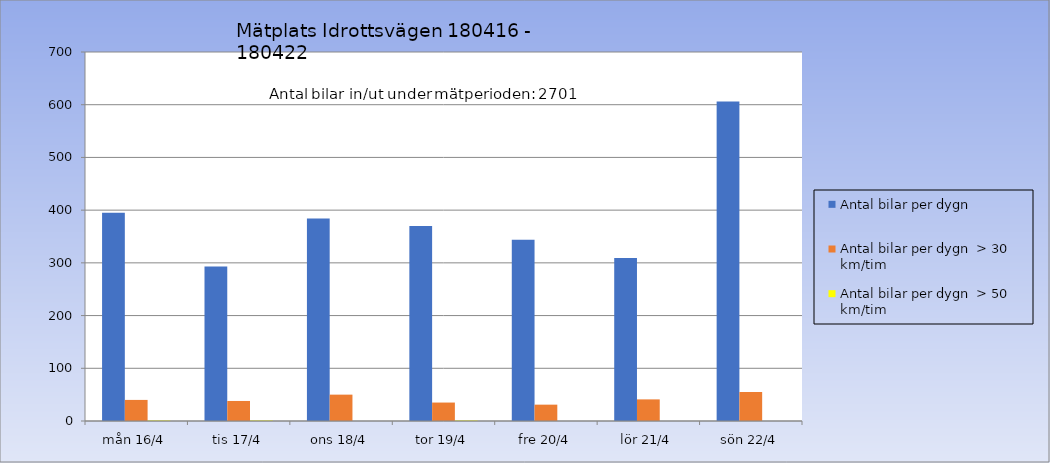
| Category | Antal bilar per dygn | Antal bilar per dygn  > 30 km/tim | Antal bilar per dygn  > 50 km/tim |
|---|---|---|---|
| mån 16/4 | 395 | 40 | 1 |
| tis 17/4 | 293 | 38 | 1 |
| ons 18/4 | 384 | 50 | 0 |
| tor 19/4 | 370 | 35 | 1 |
| fre 20/4 | 344 | 31 | 0 |
| lör 21/4 | 309 | 41 | 0 |
| sön 22/4 | 606 | 55 | 0 |